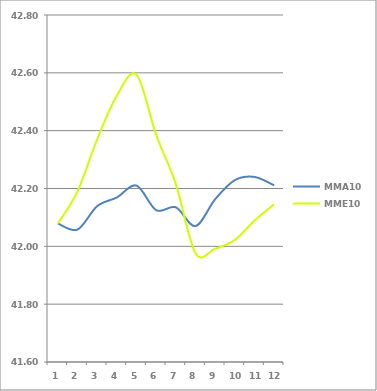
| Category | MMA10 | MME10 |
|---|---|---|
| 0 | 42.079 | 42.079 |
| 1 | 42.058 | 42.19 |
| 2 | 42.139 | 42.37 |
| 3 | 42.169 | 42.521 |
| 4 | 42.21 | 42.594 |
| 5 | 42.125 | 42.386 |
| 6 | 42.135 | 42.215 |
| 7 | 42.07 | 41.976 |
| 8 | 42.163 | 41.992 |
| 9 | 42.229 | 42.022 |
| 10 | 42.24 | 42.089 |
| 11 | 42.211 | 42.146 |